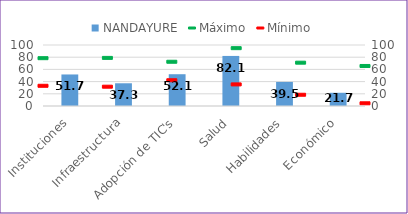
| Category | NANDAYURE |
|---|---|
| Instituciones | 51.702 |
| Infraestructura | 37.259 |
| Adopción de TIC's | 52.103 |
| Salud | 82.075 |
| Habilidades | 39.478 |
| Económico | 21.67 |